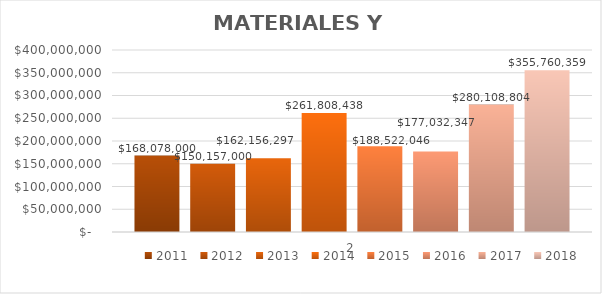
| Category | 2011 | 2012 | 2013 | 2014 | 2015 | 2016 | 2017 | 2018 |
|---|---|---|---|---|---|---|---|---|
| 0 | 168078000 | 150157000 | 162156297 | 261808438.44 | 188522046 | 177032346.82 | 280108803.64 | 355760359.49 |